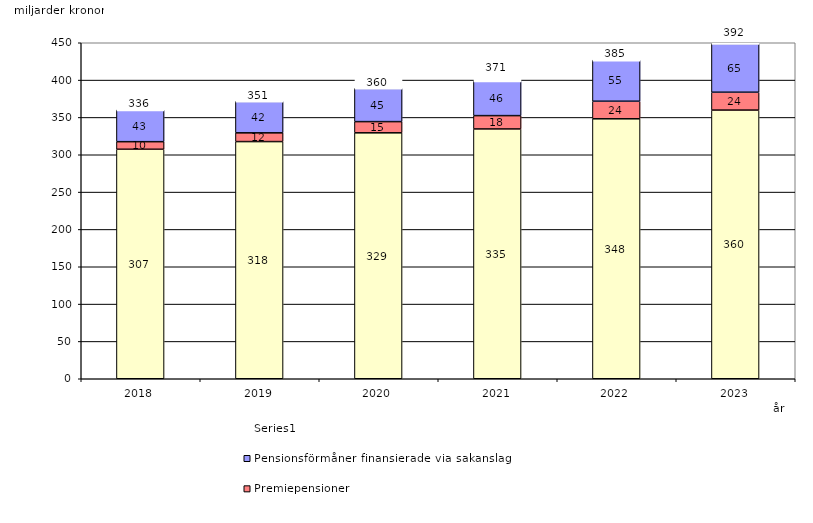
| Category | Inkomstpension och tilläggspension m.m. | Premiepensioner | Pensionsförmåner finansierade via sakanslag | Series 0 |
|---|---|---|---|---|
| 2018.0 | 307.356 | 10.141 | 42.55 | 20 |
| 2019.0 | 317.628 | 11.715 | 42.22 | 20 |
| 2020.0 | 329.365 | 15.016 | 44.546 | 20 |
| 2021.0 | 334.563 | 17.837 | 46.327 | 20 |
| 2022.0 | 348.167 | 23.519 | 55.011 | 20 |
| 2023.0 | 359.825 | 23.904 | 65.33 | 20 |